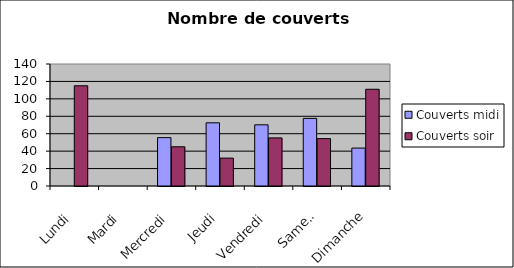
| Category | Couverts |
|---|---|
| Lundi | 115 |
| Mardi | 0 |
| Mercredi | 45 |
| Jeudi | 32 |
| Vendredi | 55.2 |
| Samedi | 54.4 |
| Dimanche | 111 |